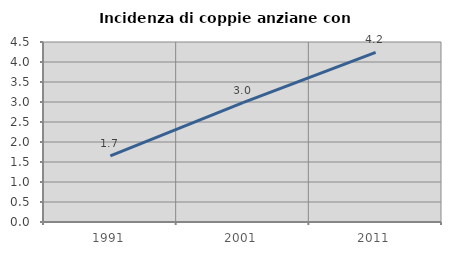
| Category | Incidenza di coppie anziane con figli |
|---|---|
| 1991.0 | 1.655 |
| 2001.0 | 2.983 |
| 2011.0 | 4.238 |